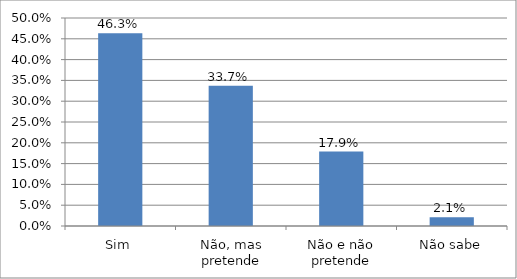
| Category | Series 0 |
|---|---|
| Sim | 0.463 |
| Não, mas pretende | 0.337 |
| Não e não pretende | 0.179 |
| Não sabe | 0.021 |